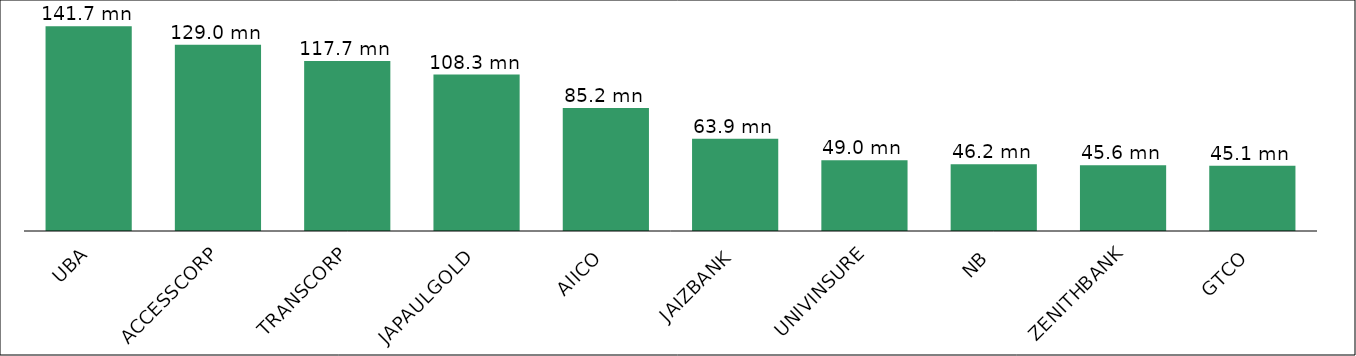
| Category | Series 0 |
|---|---|
| UBA | 141748828 |
| ACCESSCORP | 128974439 |
| TRANSCORP | 117712666 |
| JAPAULGOLD | 108340483 |
| AIICO | 85207686 |
| JAIZBANK | 63892761 |
| UNIVINSURE | 48968207 |
| NB | 46172232 |
| ZENITHBANK | 45563253 |
| GTCO | 45129099 |